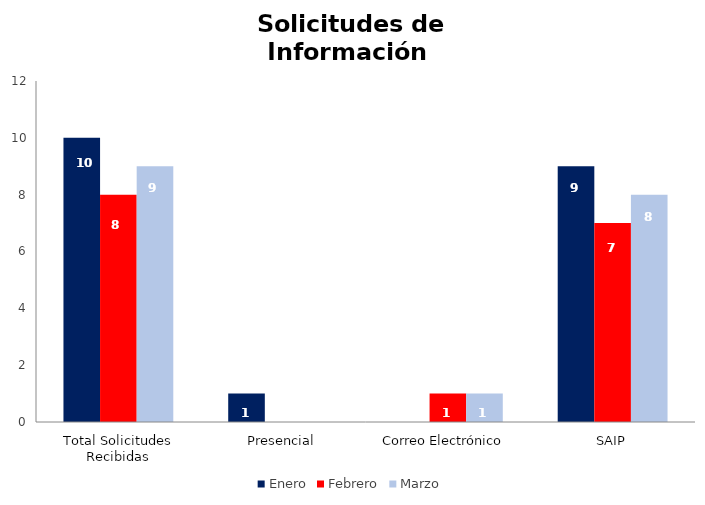
| Category | Enero | Febrero | Marzo |
|---|---|---|---|
| Total Solicitudes Recibidas | 10 | 8 | 9 |
| Presencial | 1 | 0 | 0 |
| Correo Electrónico  | 0 | 1 | 1 |
| SAIP | 9 | 7 | 8 |